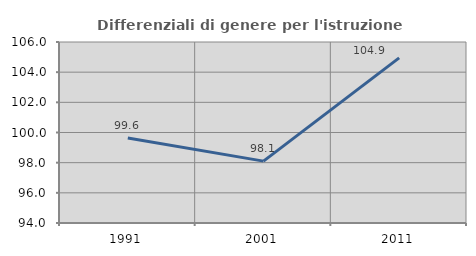
| Category | Differenziali di genere per l'istruzione superiore |
|---|---|
| 1991.0 | 99.638 |
| 2001.0 | 98.103 |
| 2011.0 | 104.945 |